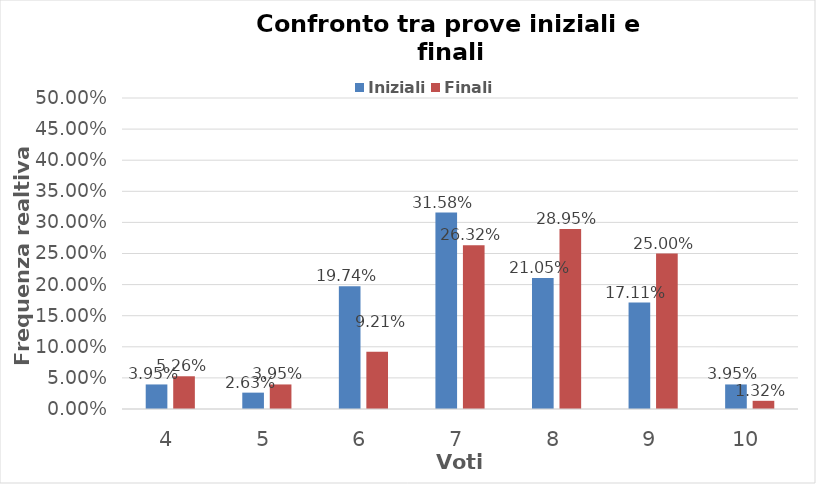
| Category | Iniziali | Finali |
|---|---|---|
| 4.0 | 0.039 | 0.053 |
| 5.0 | 0.026 | 0.039 |
| 6.0 | 0.197 | 0.092 |
| 7.0 | 0.316 | 0.263 |
| 8.0 | 0.211 | 0.289 |
| 9.0 | 0.171 | 0.25 |
| 10.0 | 0.039 | 0.013 |